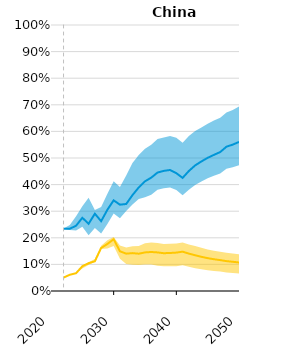
| Category | BEV_ref | PHEV_ref |
|---|---|---|
| 2022.0 | 0.234 | 0.05 |
| 2023.0 | 0.234 | 0.061 |
| 2024.0 | 0.245 | 0.067 |
| 2025.0 | 0.275 | 0.093 |
| 2026.0 | 0.253 | 0.105 |
| 2027.0 | 0.291 | 0.112 |
| 2028.0 | 0.262 | 0.162 |
| 2029.0 | 0.305 | 0.177 |
| 2030.0 | 0.341 | 0.195 |
| 2031.0 | 0.325 | 0.149 |
| 2032.0 | 0.327 | 0.14 |
| 2033.0 | 0.36 | 0.142 |
| 2034.0 | 0.389 | 0.14 |
| 2035.0 | 0.412 | 0.145 |
| 2036.0 | 0.426 | 0.147 |
| 2037.0 | 0.445 | 0.145 |
| 2038.0 | 0.452 | 0.142 |
| 2039.0 | 0.455 | 0.143 |
| 2040.0 | 0.443 | 0.144 |
| 2041.0 | 0.425 | 0.148 |
| 2042.0 | 0.451 | 0.141 |
| 2043.0 | 0.472 | 0.134 |
| 2044.0 | 0.487 | 0.128 |
| 2045.0 | 0.501 | 0.124 |
| 2046.0 | 0.512 | 0.119 |
| 2047.0 | 0.522 | 0.116 |
| 2048.0 | 0.543 | 0.112 |
| 2049.0 | 0.55 | 0.11 |
| 2050.0 | 0.56 | 0.107 |